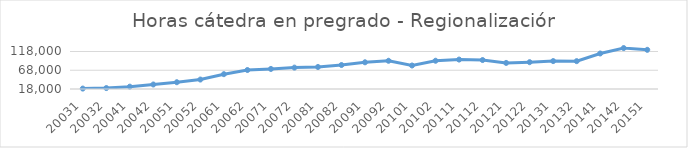
| Category | Total horas |
|---|---|
| 20031 | 19132 |
| 20032 | 20470 |
| 20041 | 24227 |
| 20042 | 30021 |
| 20051 | 36066 |
| 20052 | 43197 |
| 20061 | 57554 |
| 20062 | 68608 |
| 20071 | 71461 |
| 20072 | 75017 |
| 20081 | 76699 |
| 20082 | 81948 |
| 20091 | 89212 |
| 20092 | 93259 |
| 20101 | 80656 |
| 20102 | 93352 |
| 20111 | 96488 |
| 20112 | 95230 |
| 20121 | 87544 |
| 20122 | 89538 |
| 20131 | 92426 |
| 20132 | 92254 |
| 20141 | 112702 |
| 20142 | 127151 |
| 20151 | 122479 |